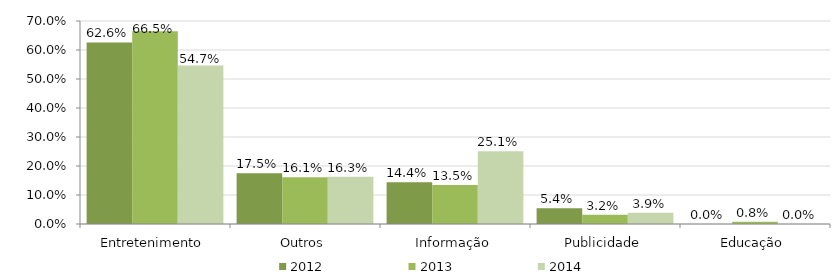
| Category | 2012 | 2013 | 2014 |
|---|---|---|---|
| Entretenimento | 0.626 | 0.665 | 0.547 |
| Outros | 0.175 | 0.161 | 0.163 |
| Informação | 0.144 | 0.135 | 0.251 |
| Publicidade | 0.054 | 0.032 | 0.039 |
| Educação | 0 | 0.008 | 0 |